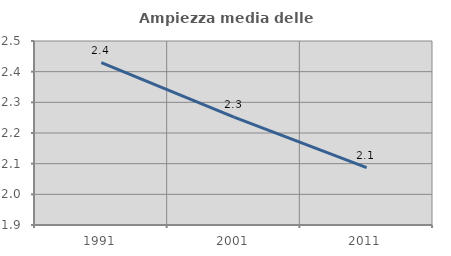
| Category | Ampiezza media delle famiglie |
|---|---|
| 1991.0 | 2.429 |
| 2001.0 | 2.252 |
| 2011.0 | 2.087 |